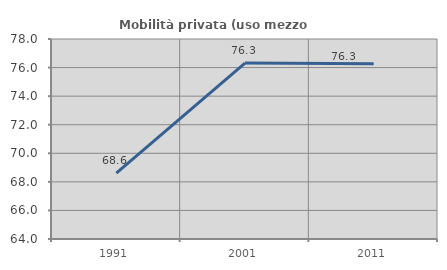
| Category | Mobilità privata (uso mezzo privato) |
|---|---|
| 1991.0 | 68.614 |
| 2001.0 | 76.316 |
| 2011.0 | 76.274 |